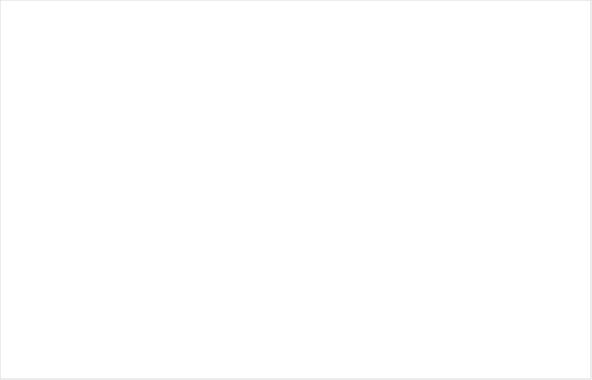
| Category | Ingen brist | Föreläggande | Föreläggande vid vite |
|---|---|---|---|
| Enskild en enhet | 0.865 | 0.058 | 0.077 |
| Enskild flera enhet | 0.892 | 0.081 | 0.027 |
| Offentlig | 0.868 | 0.118 | 0.014 |